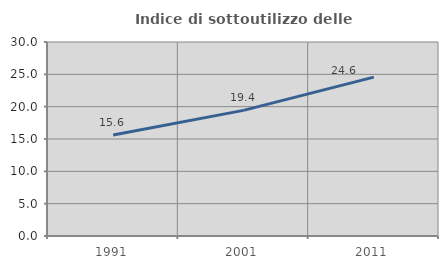
| Category | Indice di sottoutilizzo delle abitazioni  |
|---|---|
| 1991.0 | 15.628 |
| 2001.0 | 19.426 |
| 2011.0 | 24.564 |